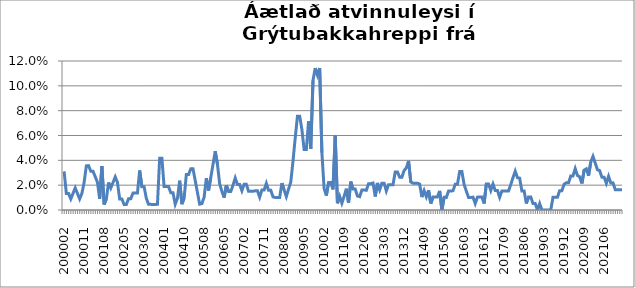
| Category | Series 0 |
|---|---|
| 200002 | 0.031 |
| 200003 | 0.013 |
| 200004 | 0.013 |
| 200005 | 0.009 |
| 200006 | 0.013 |
| 200007 | 0.018 |
| 200008 | 0.013 |
| 200009 | 0.009 |
| 200010 | 0.013 |
| 200011 | 0.022 |
| 200012 | 0.036 |
| 200101 | 0.036 |
| 200102 | 0.031 |
| 200103 | 0.031 |
| 200104 | 0.027 |
| 200105 | 0.022 |
| 200106 | 0.009 |
| 200107 | 0.035 |
| 200108 | 0.004 |
| 200109 | 0.009 |
| 200110 | 0.022 |
| 200111 | 0.018 |
| 200112 | 0.022 |
| 200201 | 0.027 |
| 200202 | 0.022 |
| 200203 | 0.009 |
| 200204 | 0.009 |
| 200205 | 0.004 |
| 200206 | 0.004 |
| 200207 | 0.009 |
| 200208 | 0.009 |
| 200209 | 0.014 |
| 200210 | 0.014 |
| 200211 | 0.014 |
| 200212 | 0.032 |
| 200301 | 0.019 |
| 200302 | 0.019 |
| 200303 | 0.009 |
| 200304 | 0.005 |
| 200305 | 0.005 |
| 200308 | 0.004 |
| 200309 | 0.004 |
| 200310 | 0.005 |
| 200311 | 0.042 |
| 200312 | 0.042 |
| 200401 | 0.019 |
| 200402 | 0.019 |
| 200403 | 0.019 |
| 200404 | 0.014 |
| 200405 | 0.014 |
| 200406 | 0.005 |
| 200407 | 0.009 |
| 200408 | 0.024 |
| 200409 | 0.005 |
| 200410 | 0.01 |
| 200411 | 0.029 |
| 200412 | 0.029 |
| 200501 | 0.033 |
| 200502 | 0.033 |
| 200503 | 0.024 |
| 200504 | 0.014 |
| 200505 | 0.005 |
| 200507 | 0.005 |
| 200508 | 0.01 |
| 200509 | 0.026 |
| 200510 | 0.016 |
| 200511 | 0.026 |
| 200512 | 0.037 |
| 200601 | 0.047 |
| 200602 | 0.037 |
| 200603 | 0.021 |
| 200604 | 0.015 |
| 200605 | 0.01 |
| 200606 | 0.02 |
| 200607 | 0.015 |
| 200608 | 0.015 |
| 200609 | 0.02 |
| 200610 | 0.026 |
| 200611 | 0.021 |
| 200612 | 0.021 |
| 200701 | 0.016 |
| 200702 | 0.021 |
| 200703 | 0.021 |
| 200704 | 0.015 |
| 200705 | 0.015 |
| 200706 | 0.015 |
| 200707 | 0.015 |
| 200708 | 0.015 |
| 200709 | 0.01 |
| 200710 | 0.016 |
| 200711 | 0.016 |
| 200712 | 0.022 |
| 200801 | 0.016 |
| 200802 | 0.016 |
| 200803 | 0.011 |
| 200804 | 0.01 |
| 200805 | 0.01 |
| 200806 | 0.01 |
| 200807 | 0.022 |
| 200808 | 0.016 |
| 200809 | 0.011 |
| 200810 | 0.017 |
| 200811 | 0.022 |
| 200812 | 0.039 |
| 200901 | 0.058 |
| 200902 | 0.076 |
| 200903 | 0.076 |
| 200904 | 0.065 |
| 200905 | 0.049 |
| 200906 | 0.049 |
| 200907 | 0.071 |
| 200908 | 0.049 |
| 200909 | 0.104 |
| 200910 | 0.114 |
| 200911 | 0.109 |
| 200912 | 0.114 |
| 201001 | 0.046 |
| 201002 | 0.017 |
| 201003 | 0.012 |
| 201004 | 0.022 |
| 201005 | 0.022 |
| 201006 | 0.017 |
| 201007 | 0.06 |
| 201008 | 0.005 |
| 201107 | 0.011 |
| 201108 | 0.005 |
| 201109 | 0.011 |
| 201110 | 0.017 |
| 201111 | 0.006 |
| 201112 | 0.023 |
| 201201 | 0.017 |
| 201202 | 0.017 |
| 201203 | 0.011 |
| 201204 | 0.011 |
| 201205 | 0.016 |
| 201206 | 0.016 |
| 201207 | 0.016 |
| 201208 | 0.021 |
| 201209 | 0.021 |
| 201210 | 0.022 |
| 201211 | 0.011 |
| 201212 | 0.022 |
| 201301 | 0.016 |
| 201302 | 0.022 |
| 201303 | 0.022 |
| 201304 | 0.015 |
| 201305 | 0.02 |
| 201306 | 0.02 |
| 201307 | 0.02 |
| 201308 | 0.031 |
| 201309 | 0.031 |
| 201310 | 0.026 |
| 201311 | 0.026 |
| 201312 | 0.032 |
| 201401 | 0.034 |
| 201402 | 0.04 |
| 201403 | 0.023 |
| 201404 | 0.022 |
| 201405 | 0.022 |
| 201406 | 0.022 |
| 201407 | 0.021 |
| 201408 | 0.01 |
| 201409 | 0.016 |
| 201410 | 0.011 |
| 201411 | 0.016 |
| 201412 | 0.005 |
| 201501 | 0.011 |
| 201502 | 0.011 |
| 201503 | 0.011 |
| 201504 | 0.015 |
| 201505 | 0 |
| 201506 | 0.01 |
| 201507 | 0.01 |
| 201508 | 0.015 |
| 201509 | 0.015 |
| 201510 | 0.016 |
| 201511 | 0.021 |
| 201512 | 0.021 |
| 201601 | 0.031 |
| 201602 | 0.031 |
| 201603 | 0.021 |
| 201604 | 0.015 |
| 201605 | 0.01 |
| 201606 | 0.01 |
| 201607 | 0.01 |
| 201608 | 0.005 |
| 201609 | 0.01 |
| 201610 | 0.01 |
| 201611 | 0.01 |
| 201612 | 0.005 |
| 201701 | 0.021 |
| 201702 | 0.021 |
| 201703 | 0.016 |
| 201704 | 0.021 |
| 201705 | 0.016 |
| 201706 | 0.016 |
| 201707 | 0.01 |
| 201708 | 0.015 |
| 201709 | 0.015 |
| 201710 | 0.015 |
| 201711 | 0.015 |
| 201712 | 0.021 |
| 201801 | 0.026 |
| 201802 | 0.031 |
| 201803 | 0.026 |
| 201804 | 0.026 |
| 201805 | 0.015 |
| 201806 | 0.015 |
| 201807 | 0.005 |
| 201808 | 0.011 |
| 201809 | 0.011 |
| 201810 | 0.005 |
| 201811 | 0.005 |
| 201812 | 0 |
| 201901 | 0.005 |
| 201902 | 0 |
| 201903 | 0 |
| 201904 | 0 |
| 201905 | 0 |
| 201906 | 0 |
| 201907 | 0.01 |
| 201908 | 0.01 |
| 201909 | 0.01 |
| 201910 | 0.016 |
| 201911 | 0.016 |
| 201912 | 0.021 |
| 202001 | 0.022 |
| 202002 | 0.022 |
| 202003 | 0.027 |
| 202004 | 0.027 |
| 202005 | 0.033 |
| 202006 | 0.028 |
| 202007 | 0.027 |
| 202008 | 0.021 |
| 202009 | 0.032 |
| 202010 | 0.033 |
| 202011 | 0.028 |
| 202012 | 0.039 |
| 202101 | 0.043 |
| 202102 | 0.038 |
| 202103 | 0.032 |
| 202104 | 0.032 |
| 202105 | 0.026 |
| 202106 | 0.026 |
| 202107 | 0.022 |
| 202108 | 0.027 |
| 202109 | 0.022 |
| 202110 | 0.022 |
| 202111 | 0.016 |
| 202112 | 0.016 |
| 202201 | 0.016 |
| 202202 | 0.016 |